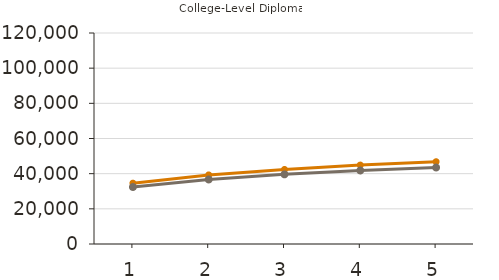
| Category | Mean | Median |
|---|---|---|
| 1.0 | 34600 | 32400 |
| 2.0 | 39300 | 36700 |
| 3.0 | 42400 | 39600 |
| 4.0 | 44900 | 41800 |
| 5.0 | 46800 | 43500 |